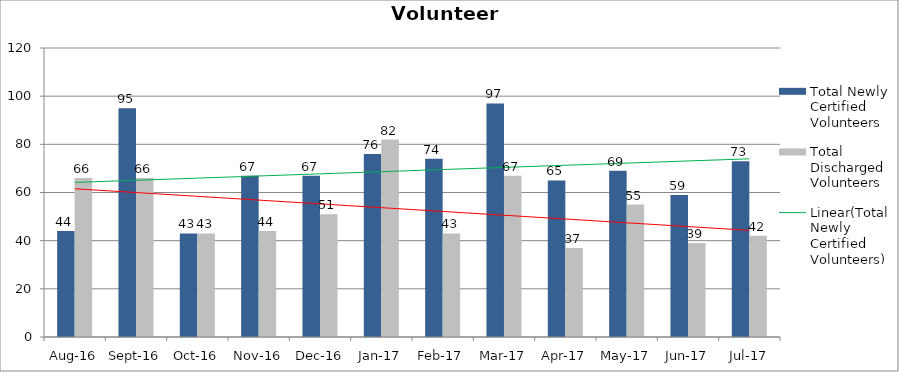
| Category | Total Newly Certified Volunteers | Total Discharged Volunteers |
|---|---|---|
| Aug-16 | 44 | 66 |
| Sep-16 | 95 | 66 |
| Oct-16 | 43 | 43 |
| Nov-16 | 67 | 44 |
| Dec-16 | 67 | 51 |
| Jan-17 | 76 | 82 |
| Feb-17 | 74 | 43 |
| Mar-17 | 97 | 67 |
| Apr-17 | 65 | 37 |
| May-17 | 69 | 55 |
| Jun-17 | 59 | 39 |
| Jul-17 | 73 | 42 |